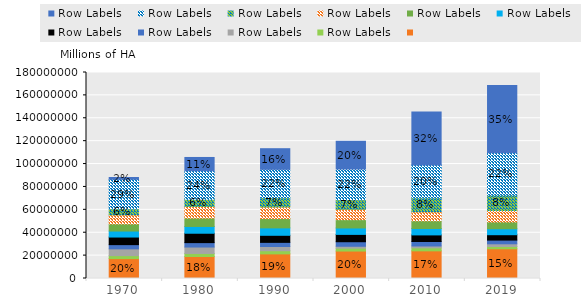
| Category | Others | Yucca | Cotton (seed) | Sorghum | Rice (shell) | Coffee (green) | Beans (dry) | Wheat | Sugar cane | Corn | Soy |
|---|---|---|---|---|---|---|---|---|---|---|---|
| 1970 | 17390697 | 2594609 | 5933532 | 3675564 | 6629612 | 5239972 | 6232834 | 7960111 | 5192525 | 25844340 | 1555433 |
| 1980 | 19230821 | 2645138 | 5614128 | 3854819 | 8207132 | 5922606 | 7347882 | 10075559 | 6326922 | 24908455 | 11623275 |
| 1990 | 21500142 | 2739098 | 3723923 | 3605174 | 6175609 | 6483876 | 8146259 | 10163965 | 7947997 | 24893989 | 18035280 |
| 2000 | 23981932 | 2512523 | 1675648 | 3960180 | 6405626 | 5625809 | 7269536 | 9033755 | 8292772 | 26881510 | 24258845 |
| 2010 | 24153821 | 2630027 | 1612917 | 3928858 | 5768021 | 5608747 | 6733897 | 7907511 | 12090821 | 28704773 | 46355032 |
| 2019 | 25948315 | 1996678 | 2371637 | 3245948 | 4704269 | 5215192 | 5923494 | 9970704 | 13390396 | 37182140 | 58625725 |